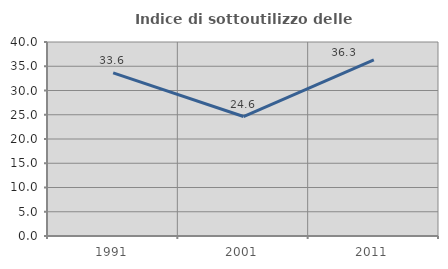
| Category | Indice di sottoutilizzo delle abitazioni  |
|---|---|
| 1991.0 | 33.649 |
| 2001.0 | 24.638 |
| 2011.0 | 36.325 |